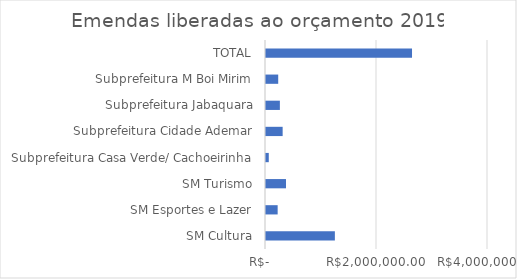
| Category | Series 0 |
|---|---|
| SM Cultura | 1241000 |
| SM Esportes e Lazer | 210000 |
| SM Turismo | 360000 |
| Subprefeitura Casa Verde/ Cachoeirinha | 50000 |
| Subprefeitura Cidade Ademar | 300000 |
| Subprefeitura Jabaquara | 250000 |
| Subprefeitura M Boi Mirim | 220000 |
| TOTAL | 2631000 |